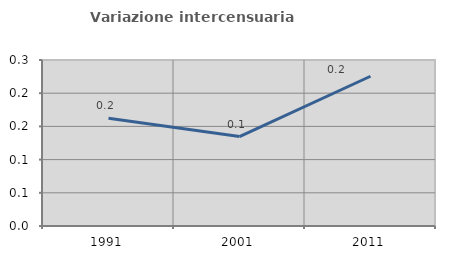
| Category | Variazione intercensuaria annua |
|---|---|
| 1991.0 | 0.162 |
| 2001.0 | 0.135 |
| 2011.0 | 0.226 |